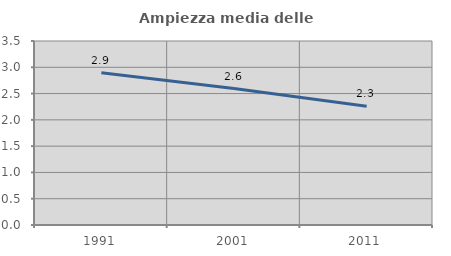
| Category | Ampiezza media delle famiglie |
|---|---|
| 1991.0 | 2.898 |
| 2001.0 | 2.594 |
| 2011.0 | 2.258 |